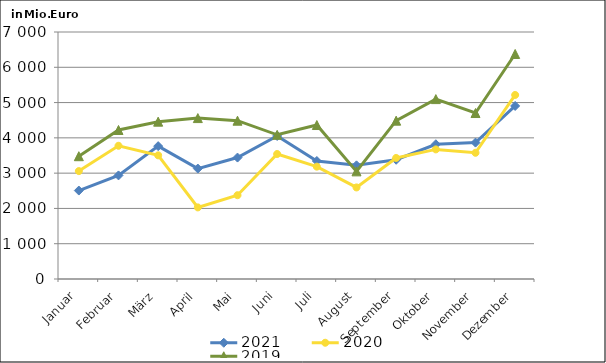
| Category | 2021 | 2020 | 2019 |
|---|---|---|---|
| Januar | 2506.328 | 3057.829 | 3480.07 |
| Februar | 2935.573 | 3775.255 | 4222.936 |
| März | 3765.174 | 3504.185 | 4458.832 |
| April | 3129.405 | 2029.114 | 4560.513 |
| Mai | 3441.396 | 2375.05 | 4486.39 |
| Juni | 4053.478 | 3542.224 | 4086.563 |
| Juli | 3344.501 | 3184.067 | 4363.895 |
| August | 3221.129 | 2595.227 | 3050.322 |
| September | 3379.055 | 3430.422 | 4487.113 |
| Oktober | 3818.815 | 3672.982 | 5098.236 |
| November | 3865.744 | 3576.665 | 4703.747 |
| Dezember | 4904.35 | 5215.398 | 6377.077 |